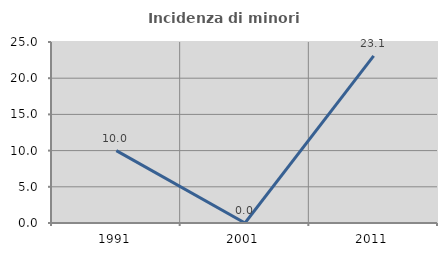
| Category | Incidenza di minori stranieri |
|---|---|
| 1991.0 | 10 |
| 2001.0 | 0 |
| 2011.0 | 23.077 |